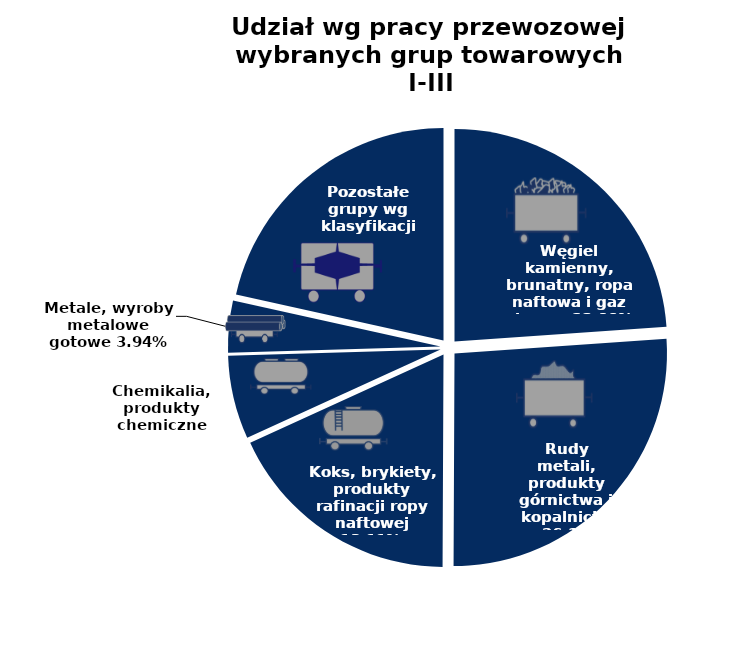
| Category | I-III kw. 2020 |
|---|---|
| Węgiel kamienny, brunatny, ropa naftowa i gaz ziemny | 0.239 |
| Rudy metali, produkty górnictwa i kopalnictwa | 0.262 |
| Koks, brykiety, produkty rafinacji ropy naftowej | 0.181 |
| Chemikalia, produkty chemiczne | 0.063 |
| Metale, wyroby metalowe gotowe | 0.039 |
| Pozostałe grupy wg klasyfikacji NST | 0.215 |